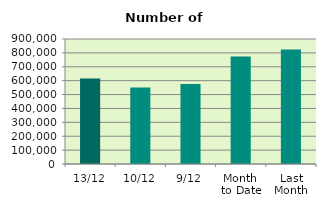
| Category | Series 0 |
|---|---|
| 13/12 | 614890 |
| 10/12 | 550136 |
| 9/12 | 575298 |
| Month 
to Date | 774439.111 |
| Last
Month | 823936.455 |